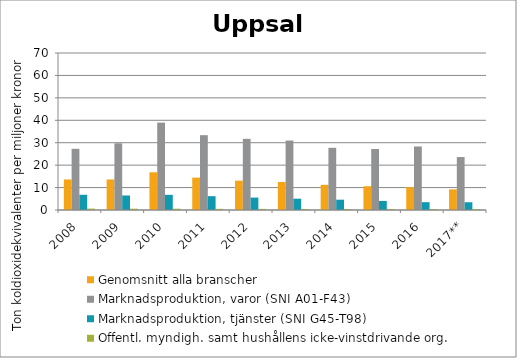
| Category | Genomsnitt alla branscher | Marknadsproduktion, varor (SNI A01-F43) | Marknadsproduktion, tjänster (SNI G45-T98) | Offentl. myndigh. samt hushållens icke-vinstdrivande org. |
|---|---|---|---|---|
| 2008 | 13.618 | 27.285 | 6.789 | 0.616 |
| 2009 | 13.614 | 29.738 | 6.477 | 0.583 |
| 2010 | 16.82 | 38.969 | 6.766 | 0.576 |
| 2011 | 14.444 | 33.364 | 6.168 | 0.521 |
| 2012 | 13.088 | 31.729 | 5.534 | 0.5 |
| 2013 | 12.476 | 30.979 | 5.042 | 0.423 |
| 2014 | 11.216 | 27.733 | 4.598 | 0.384 |
| 2015 | 10.591 | 27.198 | 4.044 | 0.421 |
| 2016 | 10.173 | 28.327 | 3.488 | 0.389 |
| 2017** | 9.197 | 23.607 | 3.464 | 0.36 |